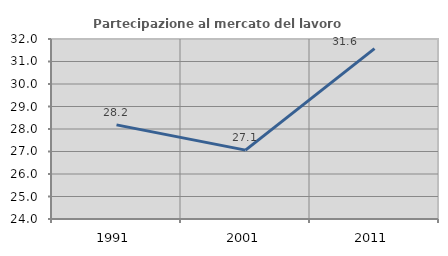
| Category | Partecipazione al mercato del lavoro  femminile |
|---|---|
| 1991.0 | 28.183 |
| 2001.0 | 27.06 |
| 2011.0 | 31.569 |